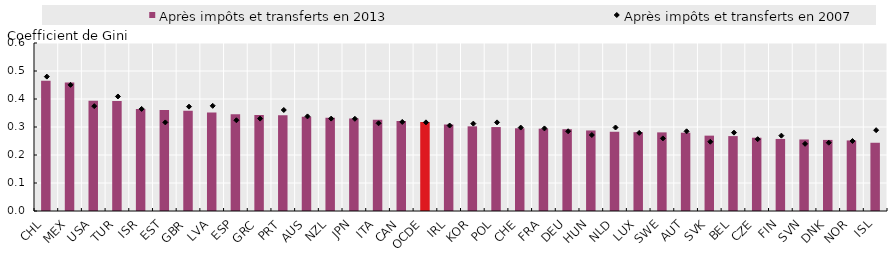
| Category | Après impôts et transferts en 2013  |
|---|---|
| CHL | 0.465 |
| MEX | 0.459 |
| USA | 0.394 |
| TUR | 0.393 |
| ISR | 0.364 |
| EST | 0.361 |
| GBR | 0.358 |
| LVA | 0.352 |
| ESP | 0.346 |
| GRC | 0.343 |
| PRT | 0.342 |
| AUS | 0.337 |
| NZL | 0.333 |
| JPN | 0.33 |
| ITA | 0.325 |
| CAN | 0.322 |
| OCDE | 0.318 |
| IRL | 0.309 |
| KOR | 0.302 |
| POL | 0.3 |
| CHE | 0.295 |
| FRA | 0.294 |
| DEU | 0.292 |
| HUN | 0.288 |
| NLD | 0.283 |
| LUX | 0.281 |
| SWE | 0.281 |
| AUT | 0.28 |
| SVK | 0.269 |
| BEL | 0.268 |
| CZE | 0.262 |
| FIN | 0.257 |
| SVN | 0.255 |
| DNK | 0.254 |
| NOR | 0.252 |
| ISL | 0.244 |